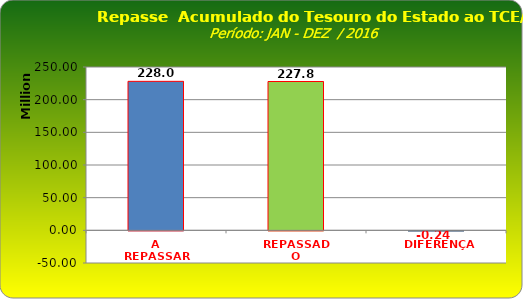
| Category | Series 0 |
|---|---|
| A REPASSAR | 228045858.36 |
| REPASSADO | 227802820.5 |
| DIFERENÇA | -243037.86 |